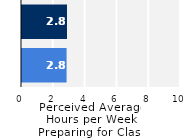
| Category | Series 0 |
|---|---|
| Upper Division | 2.804 |
| Lower Division | 2.83 |